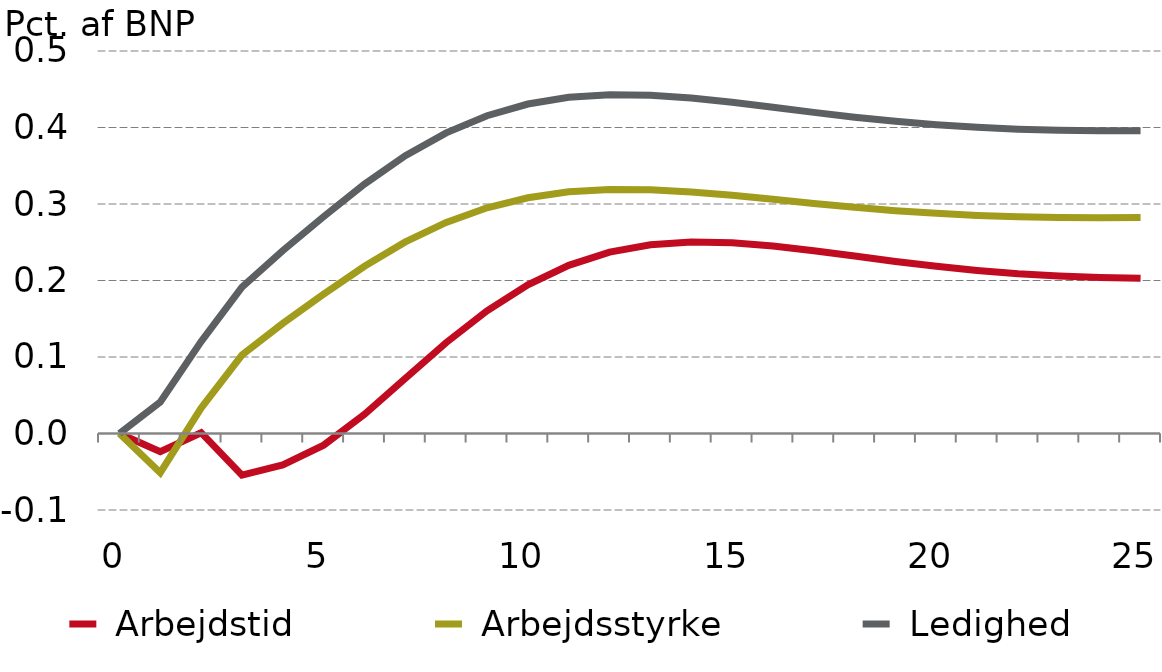
| Category |  Arbejdstid |  Arbejdsstyrke |  Ledighed |
|---|---|---|---|
| 0.0 | 0 | 0 | 0 |
| nan | -0.024 | -0.051 | 0.041 |
| nan | 0.001 | 0.033 | 0.12 |
| nan | -0.055 | 0.103 | 0.191 |
| nan | -0.041 | 0.144 | 0.239 |
| 5.0 | -0.015 | 0.182 | 0.283 |
| nan | 0.025 | 0.219 | 0.326 |
| nan | 0.072 | 0.25 | 0.363 |
| nan | 0.119 | 0.276 | 0.393 |
| nan | 0.16 | 0.295 | 0.415 |
| 10.0 | 0.194 | 0.308 | 0.431 |
| nan | 0.22 | 0.316 | 0.439 |
| nan | 0.237 | 0.319 | 0.443 |
| nan | 0.247 | 0.319 | 0.442 |
| nan | 0.25 | 0.316 | 0.438 |
| 15.0 | 0.249 | 0.311 | 0.433 |
| nan | 0.245 | 0.306 | 0.426 |
| nan | 0.239 | 0.301 | 0.42 |
| nan | 0.232 | 0.296 | 0.414 |
| nan | 0.225 | 0.291 | 0.408 |
| 20.0 | 0.219 | 0.288 | 0.404 |
| nan | 0.213 | 0.285 | 0.4 |
| nan | 0.209 | 0.283 | 0.398 |
| nan | 0.206 | 0.282 | 0.396 |
| nan | 0.204 | 0.282 | 0.396 |
| 25.0 | 0.203 | 0.282 | 0.396 |